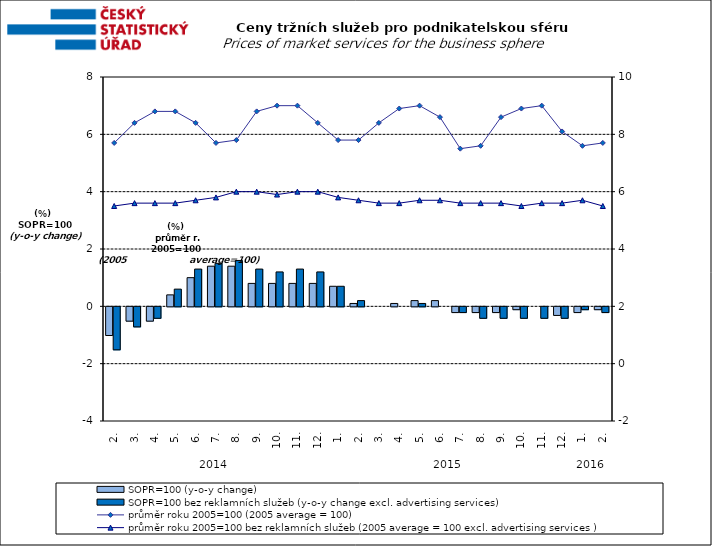
| Category | SOPR=100 (y-o-y change)   | SOPR=100 bez reklamních služeb (y-o-y change excl. advertising services)   |
|---|---|---|
| 0 | -1 | -1.5 |
| 1 | -0.5 | -0.7 |
| 2 | -0.5 | -0.4 |
| 3 | 0.4 | 0.6 |
| 4 | 1 | 1.3 |
| 5 | 1.4 | 1.5 |
| 6 | 1.4 | 1.6 |
| 7 | 0.8 | 1.3 |
| 8 | 0.8 | 1.2 |
| 9 | 0.8 | 1.3 |
| 10 | 0.8 | 1.2 |
| 11 | 0.7 | 0.7 |
| 12 | 0.1 | 0.2 |
| 13 | 0 | 0 |
| 14 | 0.1 | 0 |
| 15 | 0.2 | 0.1 |
| 16 | 0.2 | 0 |
| 17 | -0.2 | -0.2 |
| 18 | -0.2 | -0.4 |
| 19 | -0.2 | -0.4 |
| 20 | -0.1 | -0.4 |
| 21 | 0 | -0.4 |
| 22 | -0.3 | -0.4 |
| 23 | -0.2 | -0.1 |
| 24 | -0.1 | -0.2 |